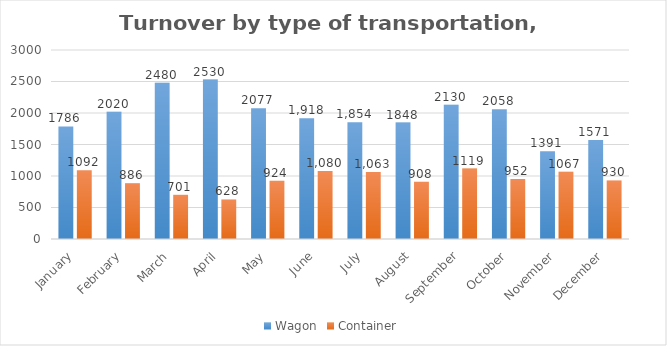
| Category | Wagon | Container |
|---|---|---|
| January | 1786 | 1092 |
| February | 2020 | 886 |
| March | 2480 | 701 |
| April | 2530 | 628 |
| May | 2077 | 924 |
| June | 1918 | 1080 |
| July | 1854 | 1063 |
| August | 1848 | 908 |
| September | 2130 | 1119 |
| October | 2058 | 952 |
| November | 1391 | 1067 |
| December | 1571 | 930 |